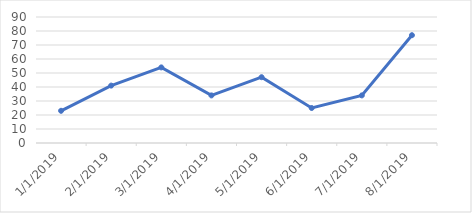
| Category | Series 0 |
|---|---|
| 1/1/19 | 23 |
| 2/1/19 | 41 |
| 3/1/19 | 54 |
| 4/1/19 | 34 |
| 5/1/19 | 47 |
| 6/1/19 | 25 |
| 7/1/19 | 34 |
| 8/1/19 | 77 |